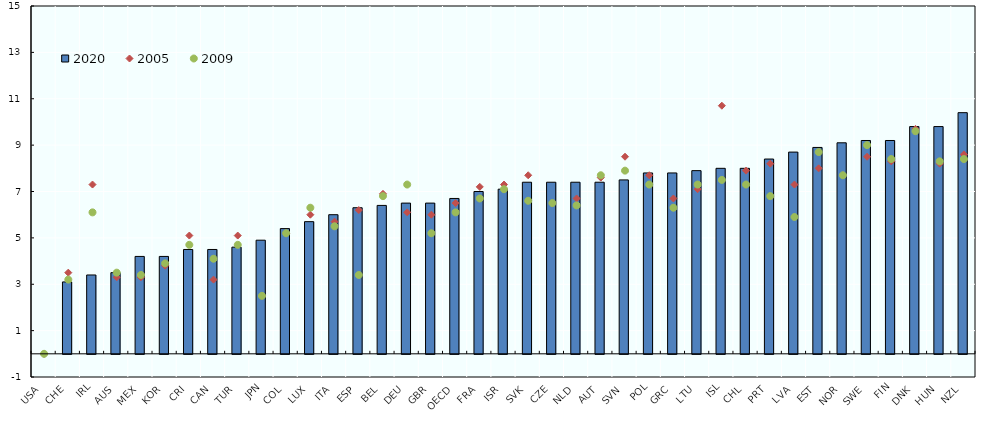
| Category | 2020 |
|---|---|
| USA | 0 |
| CHE | 3.1 |
| IRL | 3.4 |
| AUS | 3.5 |
| MEX | 4.2 |
| KOR | 4.2 |
| CRI | 4.5 |
| CAN | 4.5 |
| TUR | 4.6 |
| JPN | 4.9 |
| COL | 5.4 |
| LUX | 5.7 |
| ITA | 6 |
| ESP | 6.3 |
| BEL | 6.4 |
| DEU | 6.5 |
| GBR | 6.5 |
| OECD | 6.7 |
| FRA | 7 |
| ISR | 7.1 |
| SVK | 7.4 |
| CZE | 7.4 |
| NLD | 7.4 |
| AUT | 7.4 |
| SVN | 7.5 |
| POL | 7.8 |
| GRC | 7.8 |
| LTU | 7.9 |
| ISL | 8 |
| CHL | 8 |
| PRT | 8.4 |
| LVA | 8.7 |
| EST | 8.9 |
| NOR | 9.1 |
| SWE | 9.2 |
| FIN | 9.2 |
| DNK | 9.8 |
| HUN | 9.8 |
| NZL | 10.4 |